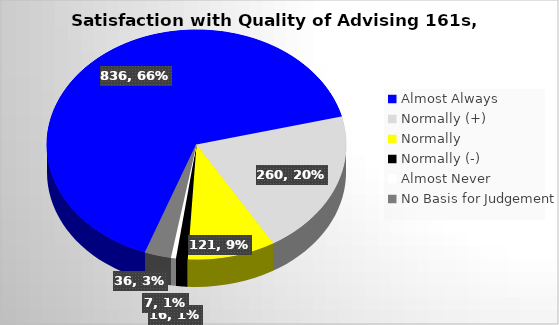
| Category | Series 0 |
|---|---|
| Almost Always | 836 |
| Normally (+) | 260 |
| Normally | 121 |
| Normally (-) | 16 |
| Almost Never | 7 |
| No Basis for Judgement | 36 |